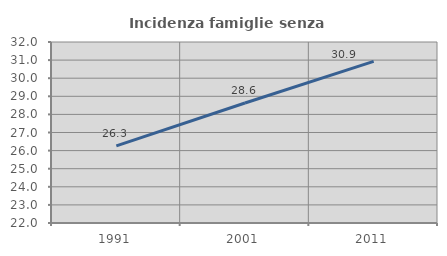
| Category | Incidenza famiglie senza nuclei |
|---|---|
| 1991.0 | 26.259 |
| 2001.0 | 28.632 |
| 2011.0 | 30.932 |